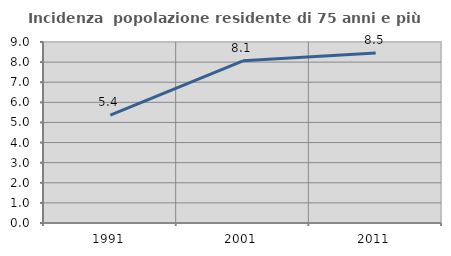
| Category | Incidenza  popolazione residente di 75 anni e più |
|---|---|
| 1991.0 | 5.362 |
| 2001.0 | 8.066 |
| 2011.0 | 8.454 |